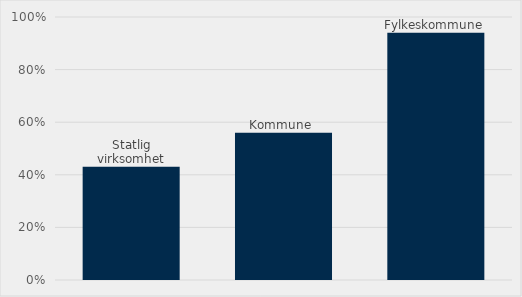
| Category | Estimert verdi som har miljø som kvalifikasjonskrav(%) |
|---|---|
| Statlig virksomhet | 0.43 |
| Kommune  | 0.56 |
| Fylkeskommune | 0.94 |